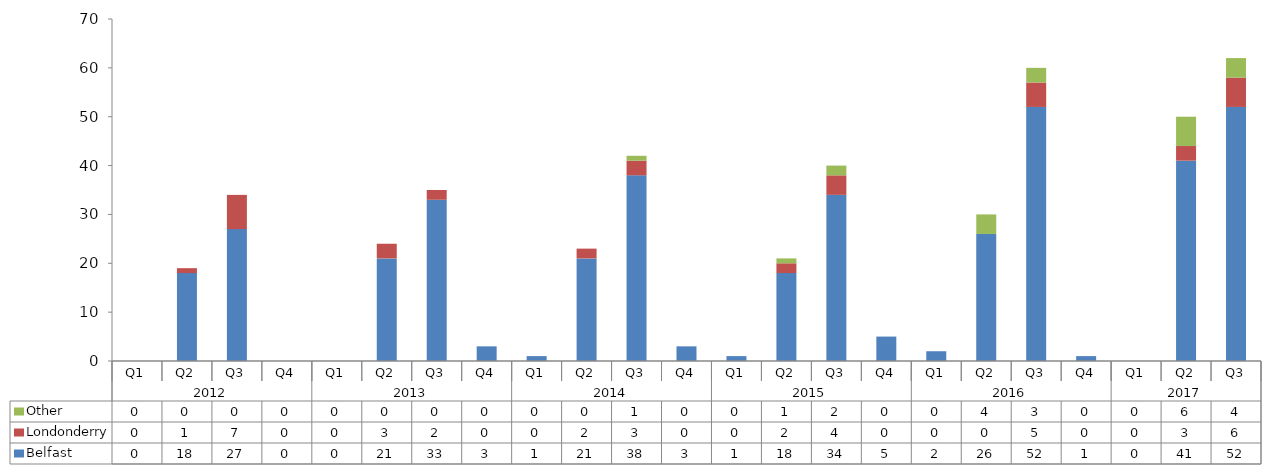
| Category | Belfast | Londonderry | Other |
|---|---|---|---|
| 0 | 0 | 0 | 0 |
| 1 | 18 | 1 | 0 |
| 2 | 27 | 7 | 0 |
| 3 | 0 | 0 | 0 |
| 4 | 0 | 0 | 0 |
| 5 | 21 | 3 | 0 |
| 6 | 33 | 2 | 0 |
| 7 | 3 | 0 | 0 |
| 8 | 1 | 0 | 0 |
| 9 | 21 | 2 | 0 |
| 10 | 38 | 3 | 1 |
| 11 | 3 | 0 | 0 |
| 12 | 1 | 0 | 0 |
| 13 | 18 | 2 | 1 |
| 14 | 34 | 4 | 2 |
| 15 | 5 | 0 | 0 |
| 16 | 2 | 0 | 0 |
| 17 | 26 | 0 | 4 |
| 18 | 52 | 5 | 3 |
| 19 | 1 | 0 | 0 |
| 20 | 0 | 0 | 0 |
| 21 | 41 | 3 | 6 |
| 22 | 52 | 6 | 4 |